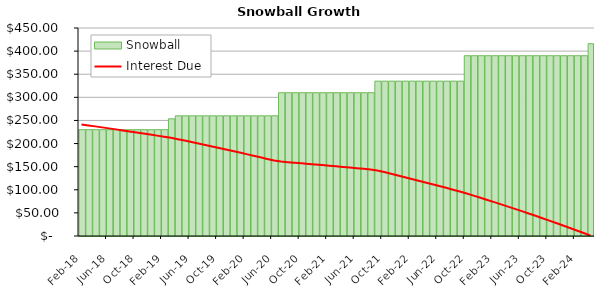
| Category | Snowball |
|---|---|
| 2018-02-01 | 230 |
| 2018-03-01 | 230 |
| 2018-04-01 | 230 |
| 2018-05-01 | 230 |
| 2018-06-01 | 230 |
| 2018-07-01 | 230 |
| 2018-08-01 | 230 |
| 2018-09-01 | 230 |
| 2018-10-01 | 230 |
| 2018-11-01 | 230 |
| 2018-12-01 | 230 |
| 2019-01-01 | 230 |
| 2019-02-01 | 230 |
| 2019-03-01 | 253.55 |
| 2019-04-01 | 260 |
| 2019-05-01 | 260 |
| 2019-06-01 | 260 |
| 2019-07-01 | 260 |
| 2019-08-01 | 260 |
| 2019-09-01 | 260 |
| 2019-10-01 | 260 |
| 2019-11-01 | 260 |
| 2019-12-01 | 260 |
| 2020-01-01 | 260 |
| 2020-02-01 | 260 |
| 2020-03-01 | 260 |
| 2020-04-01 | 260 |
| 2020-05-01 | 260 |
| 2020-06-01 | 260 |
| 2020-07-01 | 310 |
| 2020-08-01 | 310 |
| 2020-09-01 | 310 |
| 2020-10-01 | 310 |
| 2020-11-01 | 310 |
| 2020-12-01 | 310 |
| 2021-01-01 | 310 |
| 2021-02-01 | 310 |
| 2021-03-01 | 310 |
| 2021-04-01 | 310 |
| 2021-05-01 | 310 |
| 2021-06-01 | 310 |
| 2021-07-01 | 310 |
| 2021-08-01 | 310 |
| 2021-09-01 | 335 |
| 2021-10-01 | 335 |
| 2021-11-01 | 335 |
| 2021-12-01 | 335 |
| 2022-01-01 | 335 |
| 2022-02-01 | 335 |
| 2022-03-01 | 335 |
| 2022-04-01 | 335 |
| 2022-05-01 | 335 |
| 2022-06-01 | 335 |
| 2022-07-01 | 335 |
| 2022-08-01 | 335 |
| 2022-09-01 | 335 |
| 2022-10-01 | 390 |
| 2022-11-01 | 390 |
| 2022-12-01 | 390 |
| 2023-01-01 | 390 |
| 2023-02-01 | 390 |
| 2023-03-01 | 390 |
| 2023-04-01 | 390 |
| 2023-05-01 | 390 |
| 2023-06-01 | 390 |
| 2023-07-01 | 390 |
| 2023-08-01 | 390 |
| 2023-09-01 | 390 |
| 2023-10-01 | 390 |
| 2023-11-01 | 390 |
| 2023-12-01 | 390 |
| 2024-01-01 | 390 |
| 2024-02-01 | 390 |
| 2024-03-01 | 390 |
| 2024-04-01 | 416.05 |
| #N/A | 0 |
| #N/A | 0 |
| #N/A | 0 |
| #N/A | 0 |
| #N/A | 0 |
| #N/A | 0 |
| #N/A | 0 |
| #N/A | 0 |
| #N/A | 0 |
| #N/A | 0 |
| #N/A | 0 |
| #N/A | 0 |
| #N/A | 0 |
| #N/A | 0 |
| #N/A | 0 |
| #N/A | 0 |
| #N/A | 0 |
| #N/A | 0 |
| #N/A | 0 |
| #N/A | 0 |
| #N/A | 0 |
| #N/A | 0 |
| #N/A | 0 |
| #N/A | 0 |
| #N/A | 0 |
| #N/A | 0 |
| #N/A | 0 |
| #N/A | 0 |
| #N/A | 0 |
| #N/A | 0 |
| #N/A | 0 |
| #N/A | 0 |
| #N/A | 0 |
| #N/A | 0 |
| #N/A | 0 |
| #N/A | 0 |
| #N/A | 0 |
| #N/A | 0 |
| #N/A | 0 |
| #N/A | 0 |
| #N/A | 0 |
| #N/A | 0 |
| #N/A | 0 |
| #N/A | 0 |
| #N/A | 0 |
| #N/A | 0 |
| #N/A | 0 |
| #N/A | 0 |
| #N/A | 0 |
| #N/A | 0 |
| #N/A | 0 |
| #N/A | 0 |
| #N/A | 0 |
| #N/A | 0 |
| #N/A | 0 |
| #N/A | 0 |
| #N/A | 0 |
| #N/A | 0 |
| #N/A | 0 |
| #N/A | 0 |
| #N/A | 0 |
| #N/A | 0 |
| #N/A | 0 |
| #N/A | 0 |
| #N/A | 0 |
| #N/A | 0 |
| #N/A | 0 |
| #N/A | 0 |
| #N/A | 0 |
| #N/A | 0 |
| #N/A | 0 |
| #N/A | 0 |
| #N/A | 0 |
| #N/A | 0 |
| #N/A | 0 |
| #N/A | 0 |
| #N/A | 0 |
| #N/A | 0 |
| #N/A | 0 |
| #N/A | 0 |
| #N/A | 0 |
| #N/A | 0 |
| #N/A | 0 |
| #N/A | 0 |
| #N/A | 0 |
| #N/A | 0 |
| #N/A | 0 |
| #N/A | 0 |
| #N/A | 0 |
| #N/A | 0 |
| #N/A | 0 |
| #N/A | 0 |
| #N/A | 0 |
| #N/A | 0 |
| #N/A | 0 |
| #N/A | 0 |
| #N/A | 0 |
| #N/A | 0 |
| #N/A | 0 |
| #N/A | 0 |
| #N/A | 0 |
| #N/A | 0 |
| #N/A | 0 |
| #N/A | 0 |
| #N/A | 0 |
| #N/A | 0 |
| #N/A | 0 |
| #N/A | 0 |
| #N/A | 0 |
| #N/A | 0 |
| #N/A | 0 |
| #N/A | 0 |
| #N/A | 0 |
| #N/A | 0 |
| #N/A | 0 |
| #N/A | 0 |
| #N/A | 0 |
| #N/A | 0 |
| #N/A | 0 |
| #N/A | 0 |
| #N/A | 0 |
| #N/A | 0 |
| #N/A | 0 |
| #N/A | 0 |
| #N/A | 0 |
| #N/A | 0 |
| #N/A | 0 |
| #N/A | 0 |
| #N/A | 0 |
| #N/A | 0 |
| #N/A | 0 |
| #N/A | 0 |
| #N/A | 0 |
| #N/A | 0 |
| #N/A | 0 |
| #N/A | 0 |
| #N/A | 0 |
| #N/A | 0 |
| #N/A | 0 |
| #N/A | 0 |
| #N/A | 0 |
| #N/A | 0 |
| #N/A | 0 |
| #N/A | 0 |
| #N/A | 0 |
| #N/A | 0 |
| #N/A | 0 |
| #N/A | 0 |
| #N/A | 0 |
| #N/A | 0 |
| #N/A | 0 |
| #N/A | 0 |
| #N/A | 0 |
| #N/A | 0 |
| #N/A | 0 |
| #N/A | 0 |
| #N/A | 0 |
| #N/A | 0 |
| #N/A | 0 |
| #N/A | 0 |
| #N/A | 0 |
| #N/A | 0 |
| #N/A | 0 |
| #N/A | 0 |
| #N/A | 0 |
| #N/A | 0 |
| #N/A | 0 |
| #N/A | 0 |
| #N/A | 0 |
| #N/A | 0 |
| #N/A | 0 |
| #N/A | 0 |
| #N/A | 0 |
| #N/A | 0 |
| #N/A | 0 |
| #N/A | 0 |
| #N/A | 0 |
| #N/A | 0 |
| #N/A | 0 |
| #N/A | 0 |
| #N/A | 0 |
| #N/A | 0 |
| #N/A | 0 |
| #N/A | 0 |
| #N/A | 0 |
| #N/A | 0 |
| #N/A | 0 |
| #N/A | 0 |
| #N/A | 0 |
| #N/A | 0 |
| #N/A | 0 |
| #N/A | 0 |
| #N/A | 0 |
| #N/A | 0 |
| #N/A | 0 |
| #N/A | 0 |
| #N/A | 0 |
| #N/A | 0 |
| #N/A | 0 |
| #N/A | 0 |
| #N/A | 0 |
| #N/A | 0 |
| #N/A | 0 |
| #N/A | 0 |
| #N/A | 0 |
| #N/A | 0 |
| #N/A | 0 |
| #N/A | 0 |
| #N/A | 0 |
| #N/A | 0 |
| #N/A | 0 |
| #N/A | 0 |
| #N/A | 0 |
| #N/A | 0 |
| #N/A | 0 |
| #N/A | 0 |
| #N/A | 0 |
| #N/A | 0 |
| #N/A | 0 |
| #N/A | 0 |
| #N/A | 0 |
| #N/A | 0 |
| #N/A | 0 |
| #N/A | 0 |
| #N/A | 0 |
| #N/A | 0 |
| #N/A | 0 |
| #N/A | 0 |
| #N/A | 0 |
| #N/A | 0 |
| #N/A | 0 |
| #N/A | 0 |
| #N/A | 0 |
| #N/A | 0 |
| #N/A | 0 |
| #N/A | 0 |
| #N/A | 0 |
| #N/A | 0 |
| #N/A | 0 |
| #N/A | 0 |
| #N/A | 0 |
| #N/A | 0 |
| #N/A | 0 |
| #N/A | 0 |
| #N/A | 0 |
| #N/A | 0 |
| #N/A | 0 |
| #N/A | 0 |
| #N/A | 0 |
| #N/A | 0 |
| #N/A | 0 |
| #N/A | 0 |
| #N/A | 0 |
| #N/A | 0 |
| #N/A | 0 |
| #N/A | 0 |
| #N/A | 0 |
| #N/A | 0 |
| #N/A | 0 |
| #N/A | 0 |
| #N/A | 0 |
| #N/A | 0 |
| #N/A | 0 |
| #N/A | 0 |
| #N/A | 0 |
| #N/A | 0 |
| #N/A | 0 |
| #N/A | 0 |
| #N/A | 0 |
| #N/A | 0 |
| #N/A | 0 |
| #N/A | 0 |
| #N/A | 0 |
| #N/A | 0 |
| #N/A | 0 |
| #N/A | 0 |
| #N/A | 0 |
| #N/A | 0 |
| #N/A | 0 |
| #N/A | 0 |
| #N/A | 0 |
| #N/A | 0 |
| #N/A | 0 |
| #N/A | 0 |
| #N/A | 0 |